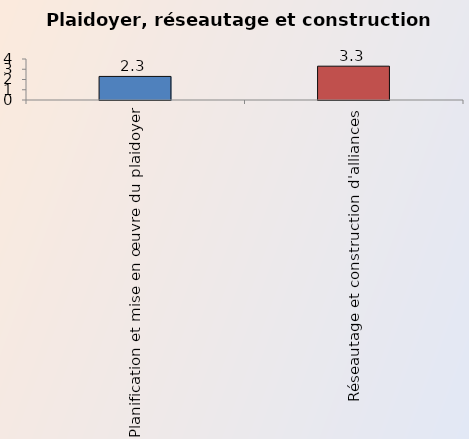
| Category | Series 0 |
|---|---|
| Planification et mise en œuvre du plaidoyer | 2.3 |
| Réseautage et construction d'alliances | 3.3 |